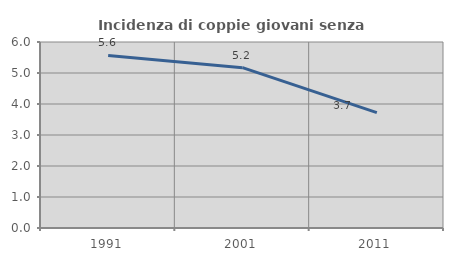
| Category | Incidenza di coppie giovani senza figli |
|---|---|
| 1991.0 | 5.567 |
| 2001.0 | 5.172 |
| 2011.0 | 3.723 |